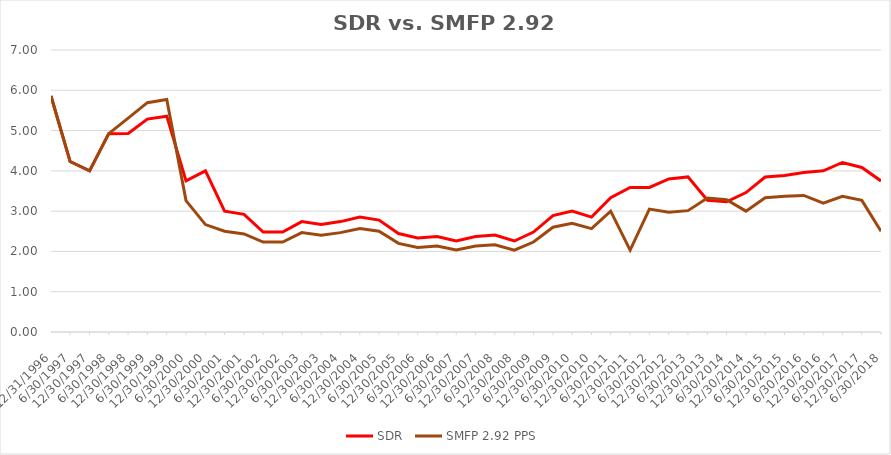
| Category | SDR | SMFP 2.92 PPS |
|---|---|---|
| 12/31/96 | 5.857 | 5.857 |
| 6/30/97 | 4.231 | 4.231 |
| 12/31/97 | 4 | 4 |
| 6/30/98 | 4.923 | 4.923 |
| 12/31/98 | 4.929 | 5.308 |
| 6/30/99 | 5.286 | 5.692 |
| 12/31/99 | 5.357 | 5.769 |
| 6/30/00 | 3.75 | 3.261 |
| 12/31/00 | 4 | 2.667 |
| 6/30/01 | 3 | 2.5 |
| 12/31/01 | 2.92 | 2.433 |
| 6/30/02 | 2.481 | 2.233 |
| 12/31/02 | 2.481 | 2.233 |
| 6/30/03 | 2.741 | 2.467 |
| 12/31/03 | 2.667 | 2.4 |
| 6/30/04 | 2.741 | 2.467 |
| 12/31/04 | 2.852 | 2.567 |
| 6/30/05 | 2.778 | 2.5 |
| 12/31/05 | 2.444 | 2.2 |
| 6/30/06 | 2.333 | 2.1 |
| 12/31/06 | 2.37 | 2.133 |
| 6/30/07 | 2.259 | 2.033 |
| 12/31/07 | 2.37 | 2.133 |
| 6/30/08 | 2.407 | 2.167 |
| 12/31/08 | 2.259 | 2.033 |
| 6/30/09 | 2.481 | 2.233 |
| 12/31/09 | 2.889 | 2.6 |
| 6/30/10 | 3 | 2.7 |
| 12/31/10 | 2.852 | 2.567 |
| 6/30/11 | 3.333 | 3 |
| 12/31/11 | 3.588 | 2.033 |
| 6/30/12 | 3.588 | 3.05 |
| 12/31/12 | 3.8 | 2.973 |
| 6/30/13 | 3.85 | 3.012 |
| 12/31/13 | 3.269 | 3.325 |
| 6/30/14 | 3.231 | 3.286 |
| 12/31/14 | 3.462 | 3 |
| 6/30/15 | 3.846 | 3.333 |
| 12/31/15 | 3.885 | 3.367 |
| 6/30/16 | 3.958 | 3.39 |
| 12/31/16 | 4 | 3.2 |
| 6/30/17 | 4.208 | 3.367 |
| 12/31/17 | 4.083 | 3.267 |
| 6/30/18 | 3.75 | 2.5 |